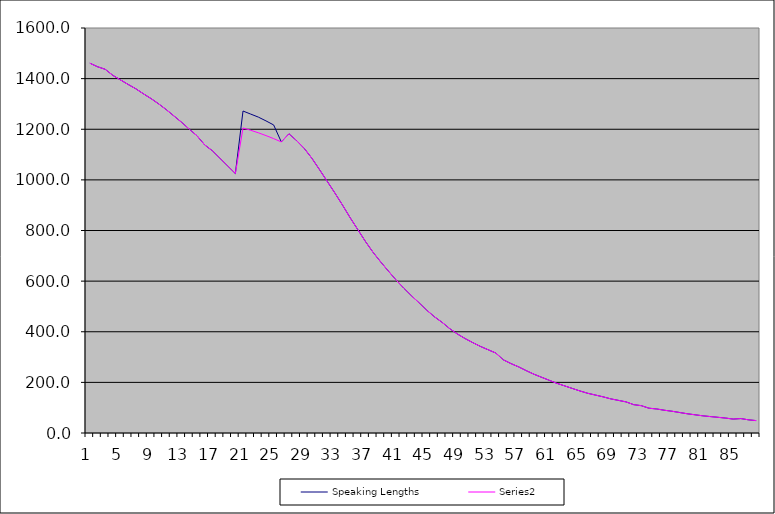
| Category | Speaking Lengths | Series 1 |
|---|---|---|
| 0 | 1461 | 1461 |
| 1 | 1447 | 1447 |
| 2 | 1437 | 1437 |
| 3 | 1413 | 1413 |
| 4 | 1395 | 1395 |
| 5 | 1377 | 1377 |
| 6 | 1360 | 1360 |
| 7 | 1340 | 1340 |
| 8 | 1321 | 1321 |
| 9 | 1300 | 1300 |
| 10 | 1277 | 1277 |
| 11 | 1252 | 1252 |
| 12 | 1227 | 1227 |
| 13 | 1200 | 1200 |
| 14 | 1174 | 1174 |
| 15 | 1138 | 1138 |
| 16 | 1115 | 1115 |
| 17 | 1085 | 1085 |
| 18 | 1055 | 1055 |
| 19 | 1025 | 1025 |
| 20 | 1272 | 1205 |
| 21 | 1260 | 1196 |
| 22 | 1248 | 1186 |
| 23 | 1233 | 1175 |
| 24 | 1217 | 1163 |
| 25 | 1150 | 1150 |
| 26 | 1182 | 1182 |
| 27 | 1155 | 1155 |
| 28 | 1124 | 1124 |
| 29 | 1085 | 1085 |
| 30 | 1040 | 1040 |
| 31 | 994 | 994 |
| 32 | 948 | 948 |
| 33 | 900 | 900 |
| 34 | 850 | 850 |
| 35 | 803 | 803 |
| 36 | 756 | 756 |
| 37 | 713 | 713 |
| 38 | 675 | 675 |
| 39 | 639 | 639 |
| 40 | 604 | 604 |
| 41 | 572 | 572 |
| 42 | 542 | 542 |
| 43 | 514 | 514 |
| 44 | 485 | 485 |
| 45 | 459 | 459 |
| 46 | 437 | 437 |
| 47 | 412 | 412 |
| 48 | 391 | 391 |
| 49 | 373 | 373 |
| 50 | 357 | 357 |
| 51 | 342 | 342 |
| 52 | 329 | 329 |
| 53 | 316 | 316 |
| 54 | 289 | 289 |
| 55 | 274 | 274 |
| 56 | 261 | 261 |
| 57 | 246 | 246 |
| 58 | 232 | 232 |
| 59 | 220 | 220 |
| 60 | 208 | 208 |
| 61 | 196 | 196 |
| 62 | 186 | 186 |
| 63 | 176 | 176 |
| 64 | 166 | 166 |
| 65 | 157 | 157 |
| 66 | 150 | 150 |
| 67 | 143 | 143 |
| 68 | 135 | 135 |
| 69 | 129 | 129 |
| 70 | 123 | 123 |
| 71 | 112 | 112 |
| 72 | 108 | 108 |
| 73 | 98 | 98 |
| 74 | 95 | 95 |
| 75 | 90 | 90 |
| 76 | 86 | 86 |
| 77 | 81 | 81 |
| 78 | 76 | 76 |
| 79 | 72 | 72 |
| 80 | 68 | 68 |
| 81 | 65 | 65 |
| 82 | 62 | 62 |
| 83 | 59 | 59 |
| 84 | 55 | 55 |
| 85 | 57 | 57 |
| 86 | 52 | 52 |
| 87 | 49 | 49 |